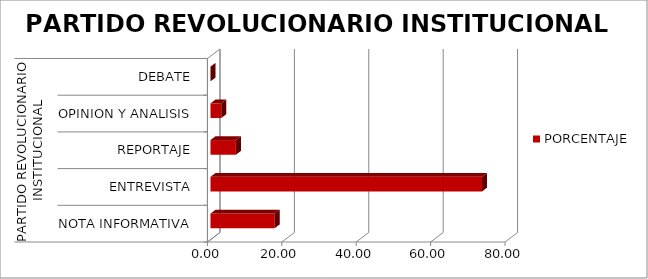
| Category | PORCENTAJE |
|---|---|
| 0 | 17.275 |
| 1 | 73 |
| 2 | 6.831 |
| 3 | 2.894 |
| 4 | 0 |